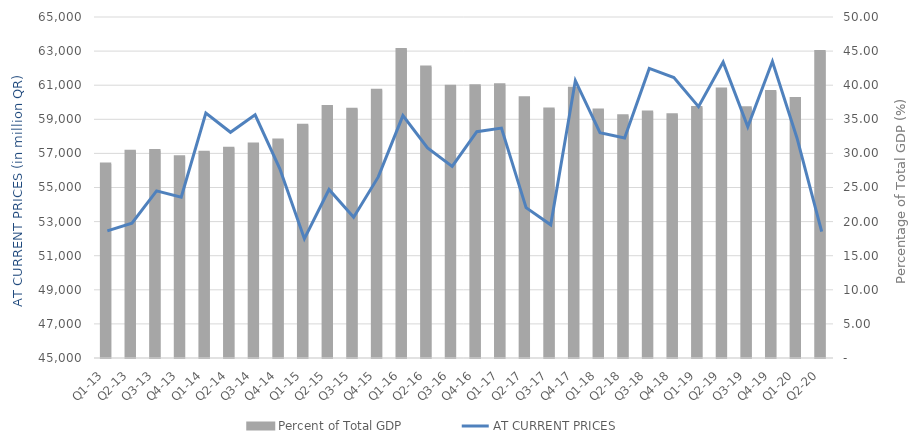
| Category | Percent of Total GDP |
|---|---|
| Q1-13 | 28.448 |
| Q2-13 | 30.301 |
| Q3-13 | 30.438 |
| Q4-13 | 29.527 |
| Q1-14 | 30.151 |
| Q2-14 | 30.756 |
| Q3-14 | 31.389 |
| Q4-14 | 31.951 |
| Q1-15 | 34.139 |
| Q2-15 | 36.869 |
| Q3-15 | 36.486 |
| Q4-15 | 39.272 |
| Q1-16 | 45.24 |
| Q2-16 | 42.68 |
| Q3-16 | 39.862 |
| Q4-16 | 39.906 |
| Q1-17 | 40.062 |
| Q2-17 | 38.175 |
| Q3-17 | 36.524 |
| Q4-17 | 39.567 |
| Q1-18 | 36.349 |
| Q2-18 | 35.531 |
| Q3-18 | 36.056 |
| Q4-18 | 35.663 |
| Q1-19 | 36.718 |
| Q2-19 | 39.43 |
| Q3-19 | 36.7 |
| Q4-19 | 39.079 |
| Q1-20 | 38.046 |
| Q2-20 | 44.949 |